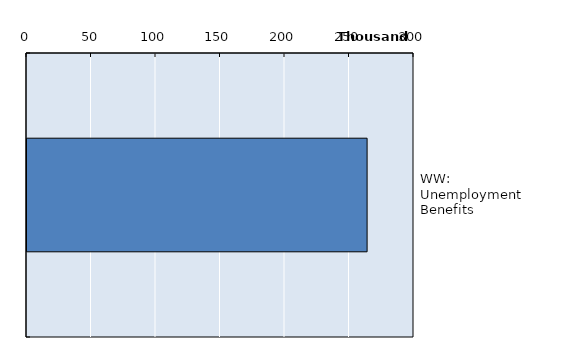
| Category | Series 0 |
|---|---|
| WW: Unemployment Benefits | 263648.3 |